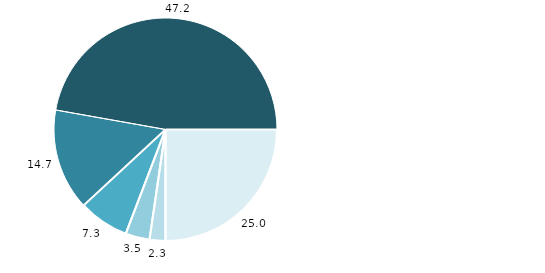
| Category |   |
|---|---|
| [Resto de los deportes] | 25 |
| <Deporte 5> | 2.3 |
| <Deporte 4> | 3.5 |
| <Deporte 3> | 7.3 |
| <Deporte 2> | 14.7 |
| <Deporte 1> | 47.2 |